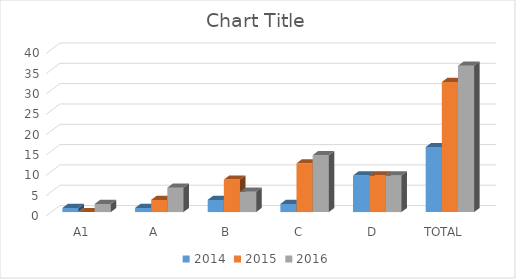
| Category | 2014 | 2015 | 2016 |
|---|---|---|---|
| A1 | 1 | 0 | 2 |
| A | 1 | 3 | 6 |
| B | 3 | 8 | 5 |
| C | 2 | 12 | 14 |
| D | 9 | 9 | 9 |
| TOTAL | 16 | 32 | 36 |